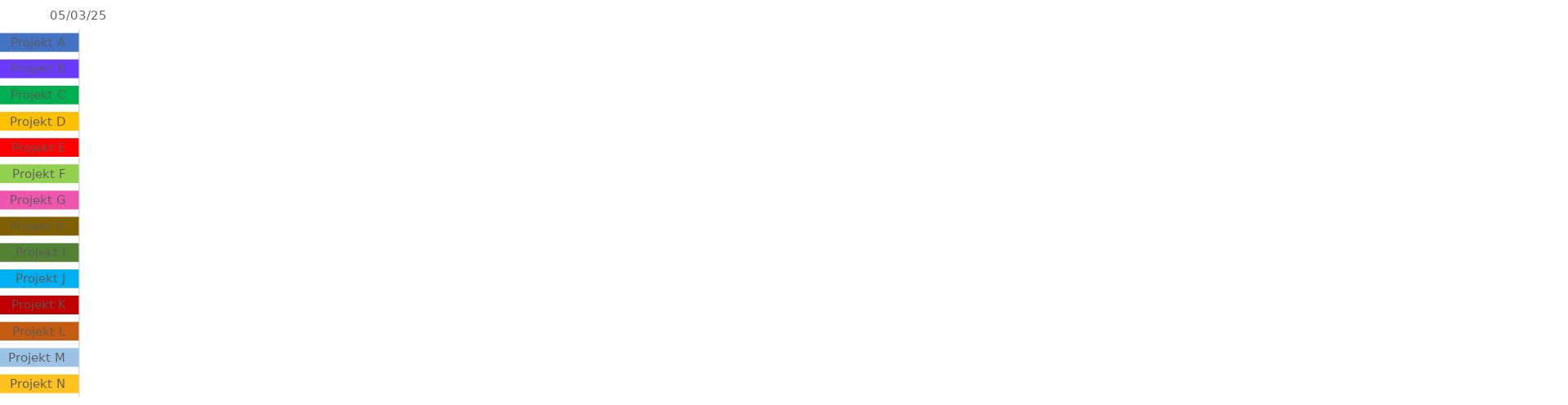
| Category | STARTDATUM | Dauer |
|---|---|---|
| Projekt A |  | 1 |
| Projekt B |  | 1 |
| Projekt C |  | 1 |
| Projekt D |  | 1 |
| Projekt E |  | 1 |
| Projekt F |  | 1 |
| Projekt G |  | 1 |
| Projekt H |  | 1 |
| Projekt I |  | 1 |
| Projekt J |  | 1 |
| Projekt K |  | 1 |
| Projekt L |  | 1 |
| Projekt M |  | 1 |
| Projekt N |  | 1 |